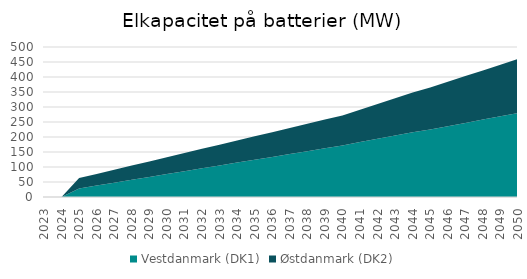
| Category | Vestdanmark (DK1) | Østdanmark (DK2) |
|---|---|---|
| 2023.0 | 0 | 0 |
| 2024.0 | 0 | 0 |
| 2025.0 | 28.56 | 34.38 |
| 2026.0 | 38.13 | 38.75 |
| 2027.0 | 47.69 | 43.13 |
| 2028.0 | 57.25 | 47.5 |
| 2029.0 | 66.81 | 51.88 |
| 2030.0 | 76.38 | 56.25 |
| 2031.0 | 85.94 | 60.63 |
| 2032.0 | 95.5 | 65 |
| 2033.0 | 105.06 | 69.38 |
| 2034.0 | 114.63 | 73.75 |
| 2035.0 | 124.19 | 78.13 |
| 2036.0 | 133.75 | 82.5 |
| 2037.0 | 143.31 | 86.88 |
| 2038.0 | 152.88 | 91.25 |
| 2039.0 | 162.44 | 95.63 |
| 2040.0 | 172 | 100 |
| 2041.0 | 183 | 108 |
| 2042.0 | 194 | 116 |
| 2043.0 | 205 | 124 |
| 2044.0 | 216 | 132 |
| 2045.0 | 225 | 140 |
| 2046.0 | 236 | 148 |
| 2047.0 | 247 | 156 |
| 2048.0 | 258 | 164 |
| 2049.0 | 269 | 172 |
| 2050.0 | 280 | 180 |